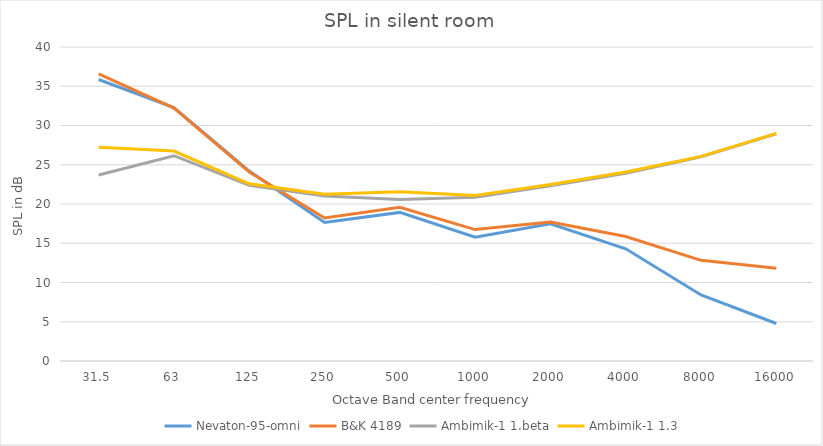
| Category | Nevaton-95-omni | B&K 4189 | Ambimik-1 1.beta | Ambimik-1 1.3 |
|---|---|---|---|---|
| 31.5 | 35.86 | 36.59 | 23.7 | 27.24 |
| 63.0 | 32.27 | 32.22 | 26.15 | 26.75 |
| 125.0 | 24.2 | 24.08 | 22.37 | 22.57 |
| 250.0 | 17.64 | 18.22 | 21.01 | 21.24 |
| 500.0 | 18.93 | 19.57 | 20.58 | 21.56 |
| 1000.0 | 15.77 | 16.74 | 20.86 | 21.08 |
| 2000.0 | 17.48 | 17.71 | 22.33 | 22.49 |
| 4000.0 | 14.3 | 15.86 | 23.9 | 24.07 |
| 8000.0 | 8.41 | 12.82 | 26.02 | 26.07 |
| 16000.0 | 4.78 | 11.81 | 28.95 | 28.99 |